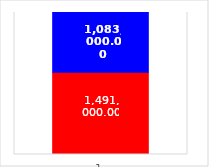
| Category | Series 2 | Series 1 | Series 0 |
|---|---|---|---|
| 0 |  | 1491000 | 1083000 |